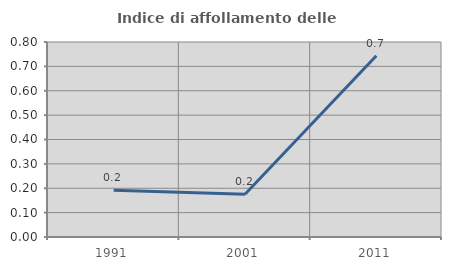
| Category | Indice di affollamento delle abitazioni  |
|---|---|
| 1991.0 | 0.192 |
| 2001.0 | 0.175 |
| 2011.0 | 0.743 |